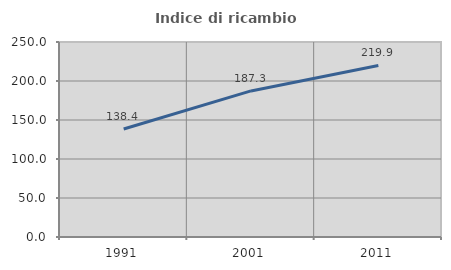
| Category | Indice di ricambio occupazionale  |
|---|---|
| 1991.0 | 138.387 |
| 2001.0 | 187.286 |
| 2011.0 | 219.893 |